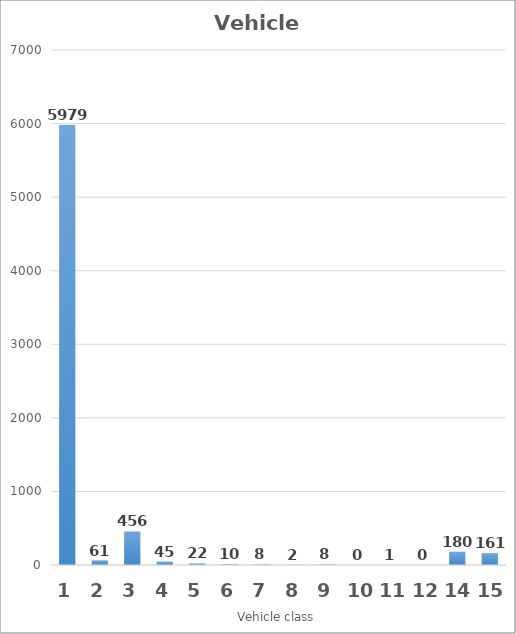
| Category | Series 0 |
|---|---|
| 1.0 | 5979 |
| 2.0 | 61 |
| 3.0 | 456 |
| 4.0 | 45 |
| 5.0 | 22 |
| 6.0 | 10 |
| 7.0 | 8 |
| 8.0 | 2 |
| 9.0 | 8 |
| 10.0 | 0 |
| 11.0 | 1 |
| 12.0 | 0 |
| 14.0 | 180 |
| 15.0 | 161 |